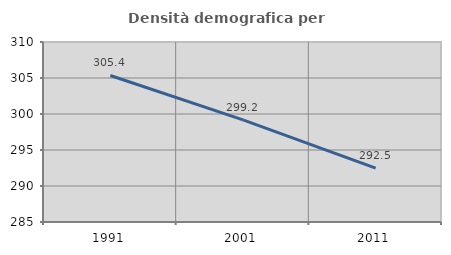
| Category | Densità demografica |
|---|---|
| 1991.0 | 305.351 |
| 2001.0 | 299.194 |
| 2011.0 | 292.486 |